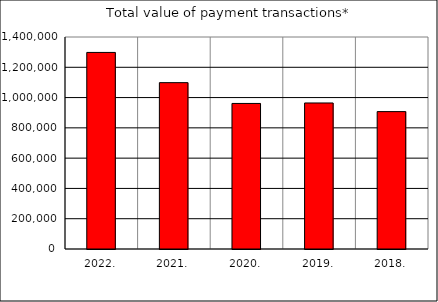
| Category | Total value of payment transactions* |
|---|---|
| 2022. | 1298099.939 |
| 2021. | 1098511.155 |
| 2020. | 961218.782 |
| 2019. | 964271.9 |
| 2018. | 907229.269 |